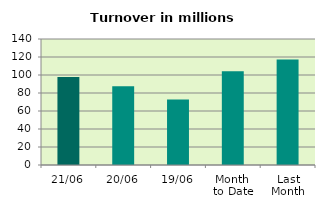
| Category | Series 0 |
|---|---|
| 21/06 | 97.898 |
| 20/06 | 87.391 |
| 19/06 | 72.655 |
| Month 
to Date | 104.164 |
| Last
Month | 117.306 |